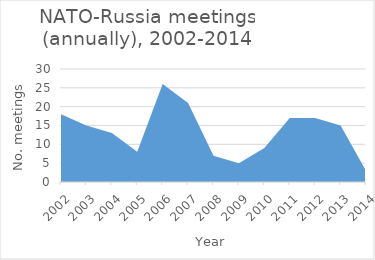
| Category | Number of meetings |
|---|---|
| 2002.0 | 18 |
| 2003.0 | 15 |
| 2004.0 | 13 |
| 2005.0 | 8 |
| 2006.0 | 26 |
| 2007.0 | 21 |
| 2008.0 | 7 |
| 2009.0 | 5 |
| 2010.0 | 9 |
| 2011.0 | 17 |
| 2012.0 | 17 |
| 2013.0 | 15 |
| 2014.0 | 3 |